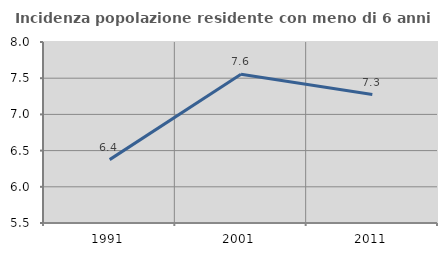
| Category | Incidenza popolazione residente con meno di 6 anni |
|---|---|
| 1991.0 | 6.375 |
| 2001.0 | 7.554 |
| 2011.0 | 7.274 |